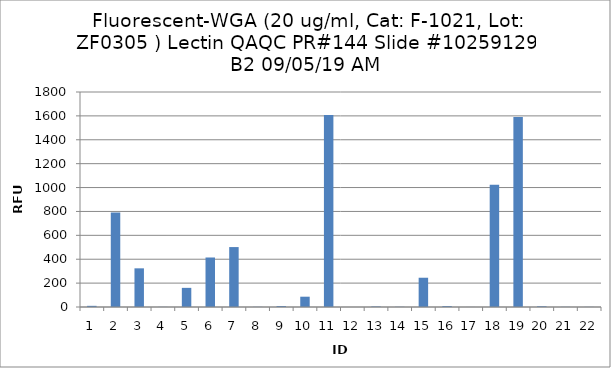
| Category | Series 0 |
|---|---|
| 0 | 9.75 |
| 1 | 791.5 |
| 2 | 323.75 |
| 3 | 1 |
| 4 | 160.25 |
| 5 | 414.5 |
| 6 | 501.75 |
| 7 | 1.25 |
| 8 | 8 |
| 9 | 86.25 |
| 10 | 1608 |
| 11 | -0.25 |
| 12 | 4.25 |
| 13 | 1.75 |
| 14 | 245 |
| 15 | 7.5 |
| 16 | 0.5 |
| 17 | 1024.25 |
| 18 | 1590.25 |
| 19 | 6 |
| 20 | 1.25 |
| 21 | 1 |